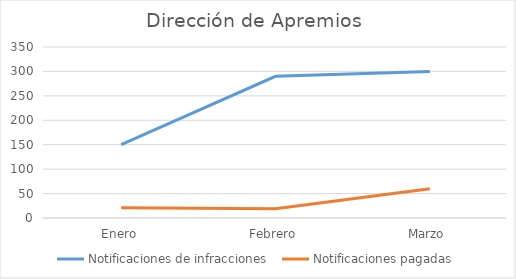
| Category | Notificaciones de infracciones  | Notificaciones pagadas |
|---|---|---|
| Enero | 150 | 21 |
| Febrero | 290 | 19 |
| Marzo | 300 | 60 |